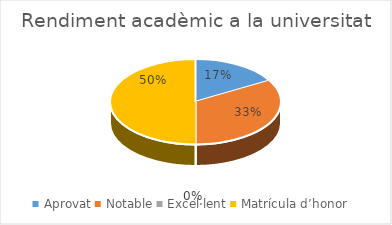
| Category | Series 0 |
|---|---|
| Aprovat | 3 |
| Notable | 6 |
| Excel·lent | 0 |
| Matrícula d’honor | 9 |